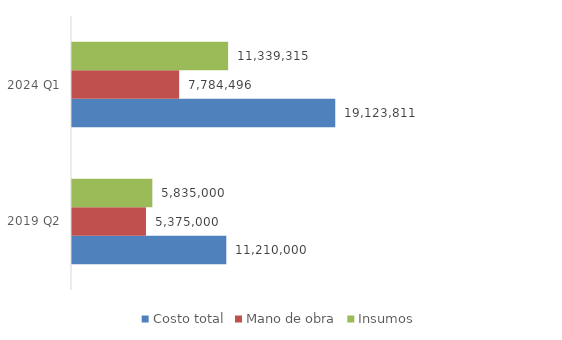
| Category | Costo total | Mano de obra | Insumos |
|---|---|---|---|
| 2019 Q2 | 11210000 | 5375000 | 5835000 |
| 2024 Q1 | 19123811.413 | 7784496 | 11339315.413 |